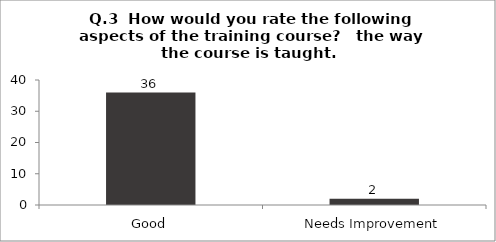
| Category | Q.3  How would you rate the following aspects of the training course?  |
|---|---|
| Good | 36 |
| Needs Improvement | 2 |